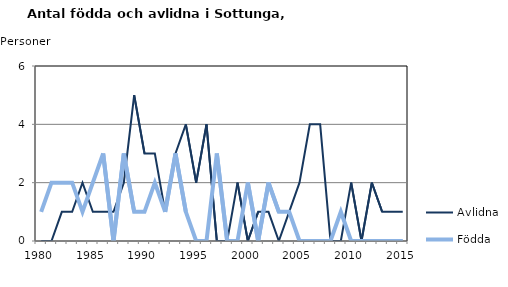
| Category | Avlidna | Födda |
|---|---|---|
| 1980.0 | 0 | 1 |
| 1981.0 | 0 | 2 |
| 1982.0 | 1 | 2 |
| 1983.0 | 1 | 2 |
| 1984.0 | 2 | 1 |
| 1985.0 | 1 | 2 |
| 1986.0 | 1 | 3 |
| 1987.0 | 1 | 0 |
| 1988.0 | 2 | 3 |
| 1989.0 | 5 | 1 |
| 1990.0 | 3 | 1 |
| 1991.0 | 3 | 2 |
| 1992.0 | 1 | 1 |
| 1993.0 | 3 | 3 |
| 1994.0 | 4 | 1 |
| 1995.0 | 2 | 0 |
| 1996.0 | 4 | 0 |
| 1997.0 | 0 | 3 |
| 1998.0 | 0 | 0 |
| 1999.0 | 2 | 0 |
| 2000.0 | 0 | 2 |
| 2001.0 | 1 | 0 |
| 2002.0 | 1 | 2 |
| 2003.0 | 0 | 1 |
| 2004.0 | 1 | 1 |
| 2005.0 | 2 | 0 |
| 2006.0 | 4 | 0 |
| 2007.0 | 4 | 0 |
| 2008.0 | 0 | 0 |
| 2009.0 | 0 | 1 |
| 2010.0 | 2 | 0 |
| 2011.0 | 0 | 0 |
| 2012.0 | 2 | 0 |
| 2013.0 | 1 | 0 |
| 2014.0 | 1 | 0 |
| 2015.0 | 1 | 0 |